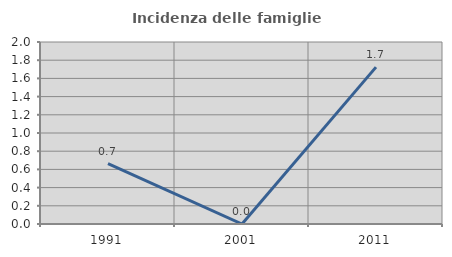
| Category | Incidenza delle famiglie numerose |
|---|---|
| 1991.0 | 0.662 |
| 2001.0 | 0 |
| 2011.0 | 1.724 |